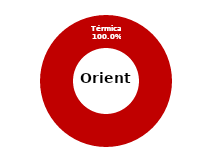
| Category | Oriente |
|---|---|
| Eólica | 0 |
| Hidráulica | 0 |
| Solar | 0 |
| Térmica | 32.971 |